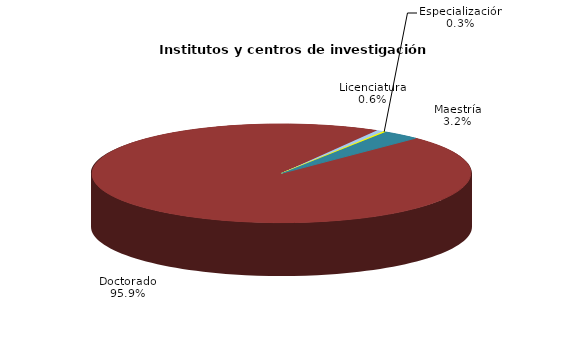
| Category | Series 0 |
|---|---|
| Licenciatura | 12 |
| Especialización | 5 |
| Maestría | 64 |
| Doctorado | 1912 |